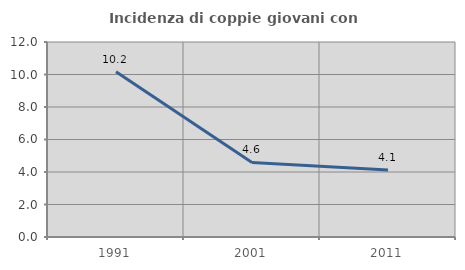
| Category | Incidenza di coppie giovani con figli |
|---|---|
| 1991.0 | 10.169 |
| 2001.0 | 4.587 |
| 2011.0 | 4.124 |